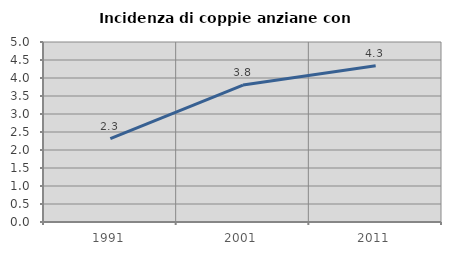
| Category | Incidenza di coppie anziane con figli |
|---|---|
| 1991.0 | 2.316 |
| 2001.0 | 3.803 |
| 2011.0 | 4.342 |